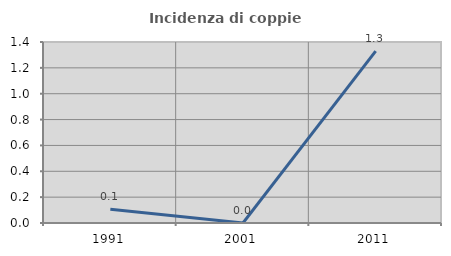
| Category | Incidenza di coppie miste |
|---|---|
| 1991.0 | 0.105 |
| 2001.0 | 0 |
| 2011.0 | 1.33 |